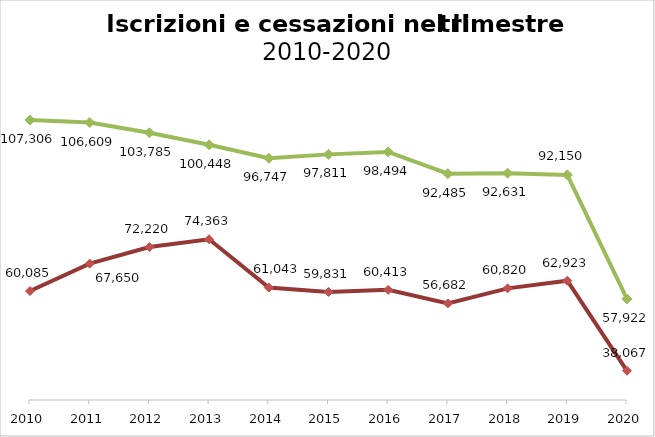
| Category | Cessazioni | Iscrizioni |
|---|---|---|
| 2010.0 | 60085 | 107306 |
| 2011.0 | 67650 | 106609 |
| 2012.0 | 72220 | 103785 |
| 2013.0 | 74363 | 100448 |
| 2014.0 | 61043 | 96747 |
| 2015.0 | 59831 | 97811 |
| 2016.0 | 60413 | 98494 |
| 2017.0 | 56682 | 92485 |
| 2018.0 | 60820 | 92631 |
| 2019.0 | 62923 | 92150 |
| 2020.0 | 38067 | 57922 |